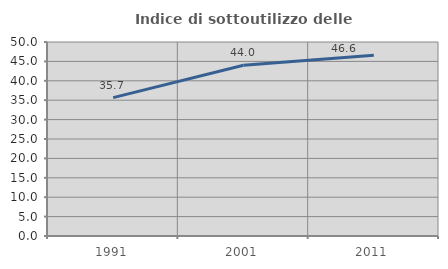
| Category | Indice di sottoutilizzo delle abitazioni  |
|---|---|
| 1991.0 | 35.658 |
| 2001.0 | 44.019 |
| 2011.0 | 46.576 |